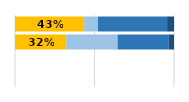
| Category | Niveles de desempeño | Series 1 | Series 2 | Series 3 |
|---|---|---|---|---|
| 0 | 0.435 | 0.087 | 0.435 | 0.043 |
| 1 | 0.323 | 0.323 | 0.323 | 0.032 |
| 2 | 0 | 0 | 0 | 0 |
| 3 | 0 | 0 | 0 | 0 |